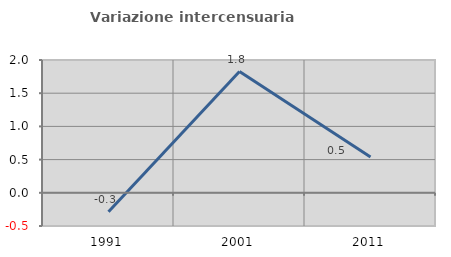
| Category | Variazione intercensuaria annua |
|---|---|
| 1991.0 | -0.286 |
| 2001.0 | 1.826 |
| 2011.0 | 0.539 |